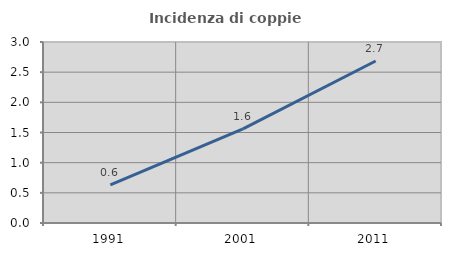
| Category | Incidenza di coppie miste |
|---|---|
| 1991.0 | 0.63 |
| 2001.0 | 1.561 |
| 2011.0 | 2.685 |